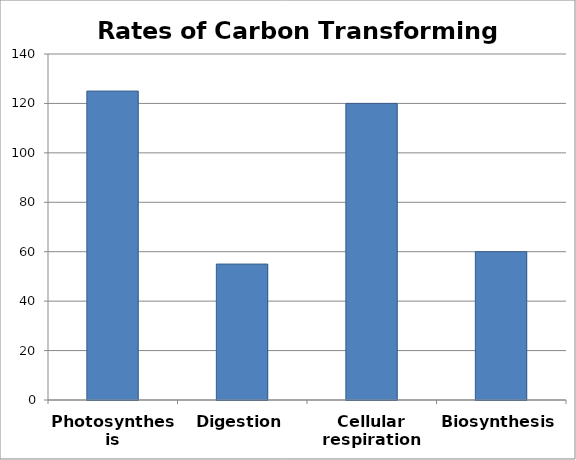
| Category | Series 0 |
|---|---|
| Photosynthesis | 125 |
| Digestion | 55 |
| Cellular respiration | 120 |
| Biosynthesis | 60 |